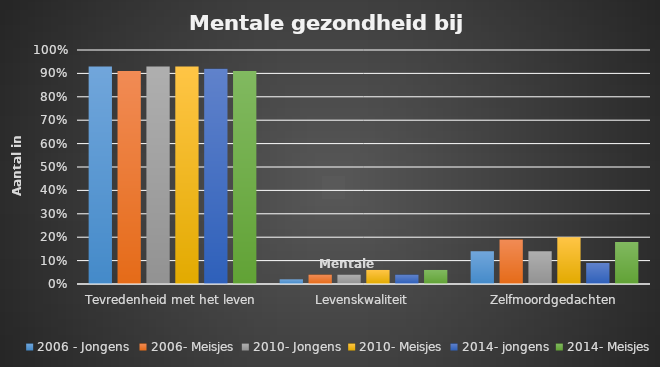
| Category | 2006 - Jongens  | 2006- Meisjes | 2010- Jongens | 2010- Meisjes | 2014- jongens | 2014- Meisjes |
|---|---|---|---|---|---|---|
| Tevredenheid met het leven | 0.93 | 0.91 | 0.93 | 0.93 | 0.92 | 0.91 |
| Levenskwaliteit | 0.02 | 0.04 | 0.04 | 0.06 | 0.04 | 0.06 |
| Zelfmoordgedachten | 0.14 | 0.19 | 0.14 | 0.2 | 0.09 | 0.18 |